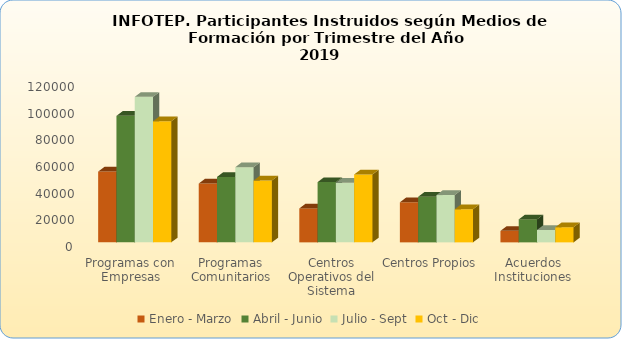
| Category | Enero - Marzo | Abril - Junio | Julio - Sept | Oct - Dic |
|---|---|---|---|---|
| Programas con Empresas | 53026 | 94785 | 109015 | 90744 |
| Programas Comunitarios | 44087 | 49035 | 56317 | 46313 |
| Centros Operativos del Sistema | 25416 | 45145 | 44708 | 50879 |
| Centros Propios | 30031 | 34153 | 35451 | 24803 |
| Acuerdos Instituciones | 8615 | 17208 | 9294 | 11343 |